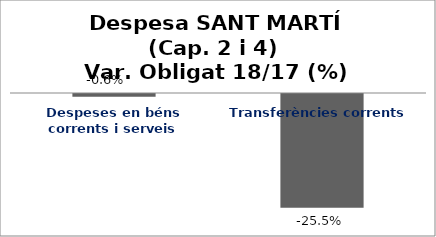
| Category | Series 0 |
|---|---|
| Despeses en béns corrents i serveis | -0.006 |
| Transferències corrents | -0.255 |